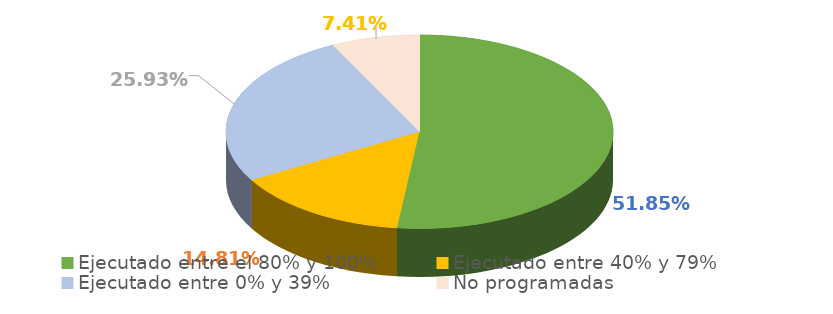
| Category | Series 0 |
|---|---|
| Ejecutado entre el 80% y 100% | 0.519 |
| Ejecutado entre 40% y 79% | 0.148 |
| Ejecutado entre 0% y 39% | 0.259 |
| No programadas | 0.074 |